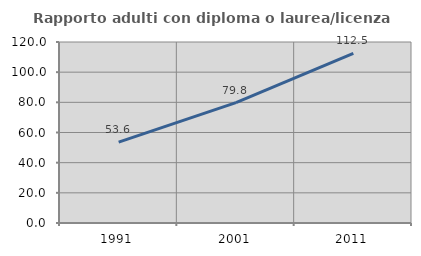
| Category | Rapporto adulti con diploma o laurea/licenza media  |
|---|---|
| 1991.0 | 53.649 |
| 2001.0 | 79.788 |
| 2011.0 | 112.495 |